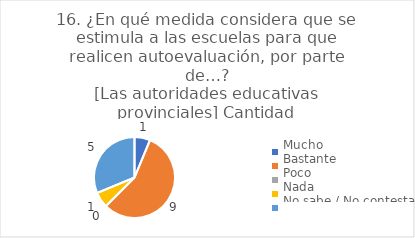
| Category | 16. ¿En qué medida considera que se estimula a las escuelas para que realicen autoevaluación, por parte de…?
[Las autoridades educativas provinciales] |
|---|---|
| Mucho  | 0.062 |
| Bastante  | 0.562 |
| Poco  | 0 |
| Nada  | 0.062 |
| No sabe / No contesta | 0.312 |